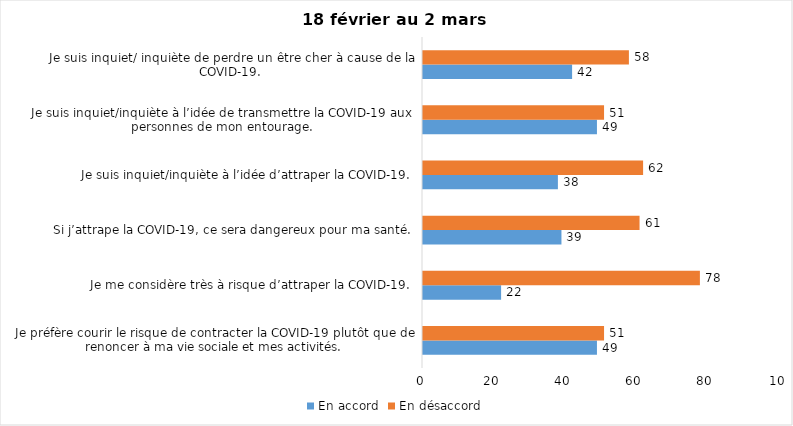
| Category | En accord | En désaccord |
|---|---|---|
| Je préfère courir le risque de contracter la COVID-19 plutôt que de renoncer à ma vie sociale et mes activités. | 49 | 51 |
| Je me considère très à risque d’attraper la COVID-19. | 22 | 78 |
| Si j’attrape la COVID-19, ce sera dangereux pour ma santé. | 39 | 61 |
| Je suis inquiet/inquiète à l’idée d’attraper la COVID-19. | 38 | 62 |
| Je suis inquiet/inquiète à l’idée de transmettre la COVID-19 aux personnes de mon entourage. | 49 | 51 |
| Je suis inquiet/ inquiète de perdre un être cher à cause de la COVID-19. | 42 | 58 |